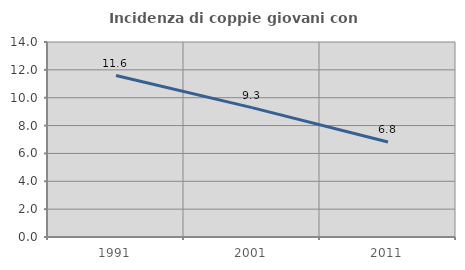
| Category | Incidenza di coppie giovani con figli |
|---|---|
| 1991.0 | 11.594 |
| 2001.0 | 9.286 |
| 2011.0 | 6.818 |